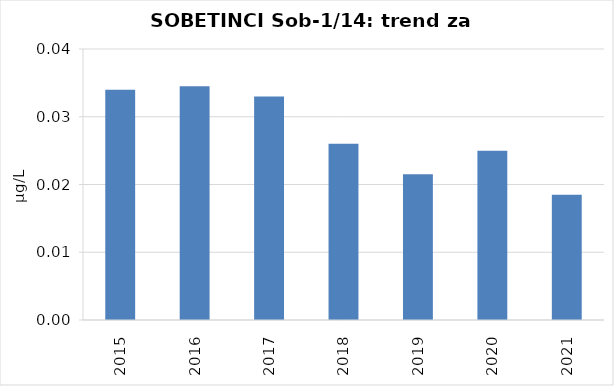
| Category | Vsota |
|---|---|
| 2015 | 0.034 |
| 2016 | 0.034 |
| 2017 | 0.033 |
| 2018 | 0.026 |
| 2019 | 0.022 |
| 2020 | 0.025 |
| 2021 | 0.019 |